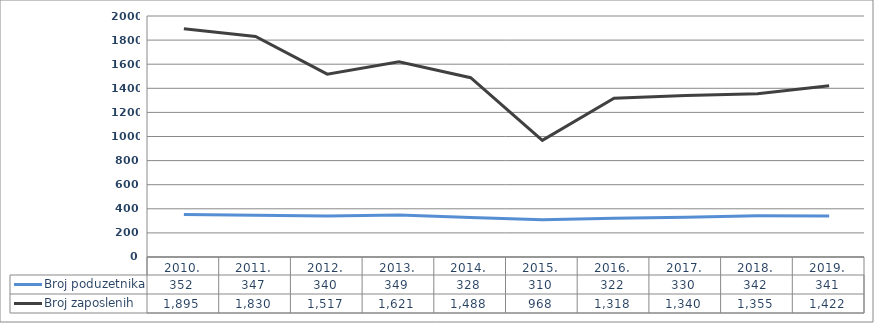
| Category | Broj poduzetnika | Broj zaposlenih |
|---|---|---|
| 2010. | 352 | 1895 |
| 2011. | 347 | 1830 |
| 2012. | 340 | 1517 |
| 2013. | 349 | 1621 |
| 2014. | 328 | 1488 |
| 2015. | 310 | 968 |
| 2016. | 322 | 1318 |
| 2017. | 330 | 1340 |
| 2018. | 342 | 1355 |
| 2019. | 341 | 1422 |